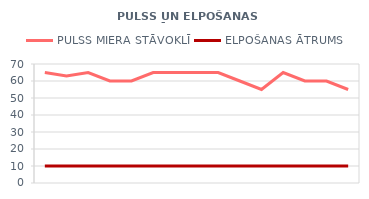
| Category | PULSS MIERA STĀVOKLĪ | ELPOŠANAS ĀTRUMS |
|---|---|---|
| 2012-06-01 | 65 | 10 |
| 2012-06-02 | 63 | 10 |
| 2012-06-03 | 65 | 10 |
| 2012-06-04 | 60 | 10 |
| 2012-06-05 | 60 | 10 |
| 2012-06-06 | 65 | 10 |
| 2012-06-07 | 65 | 10 |
| 2012-06-08 | 65 | 10 |
| 2012-06-09 | 65 | 10 |
| 2012-06-10 | 60 | 10 |
| 2012-06-11 | 55 | 10 |
| 2012-06-12 | 65 | 10 |
| 2012-06-13 | 60 | 10 |
| 2012-06-14 | 60 | 10 |
| 2012-06-15 | 55 | 10 |